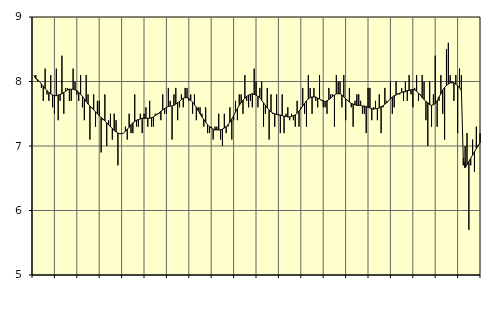
| Category | Transport, SNI 49-53 | Series 1 |
|---|---|---|
| nan | 8.1 | 8.1 |
| 1.0 | 8.1 | 8.04 |
| 1.0 | 8 | 8.03 |
| 1.0 | 8 | 8 |
| 1.0 | 7.9 | 7.96 |
| 1.0 | 7.7 | 7.93 |
| 1.0 | 8.2 | 7.89 |
| 1.0 | 7.8 | 7.86 |
| 1.0 | 7.7 | 7.83 |
| 1.0 | 8.1 | 7.81 |
| 1.0 | 7.6 | 7.79 |
| 1.0 | 7.5 | 7.78 |
| nan | 8.2 | 7.78 |
| 2.0 | 7.4 | 7.79 |
| 2.0 | 7.7 | 7.8 |
| 2.0 | 8.4 | 7.81 |
| 2.0 | 7.5 | 7.83 |
| 2.0 | 7.9 | 7.85 |
| 2.0 | 7.9 | 7.87 |
| 2.0 | 7.7 | 7.88 |
| 2.0 | 7.7 | 7.88 |
| 2.0 | 8.2 | 7.88 |
| 2.0 | 8 | 7.87 |
| 2.0 | 7.8 | 7.86 |
| nan | 7.7 | 7.83 |
| 3.0 | 8.1 | 7.8 |
| 3.0 | 7.6 | 7.77 |
| 3.0 | 7.4 | 7.73 |
| 3.0 | 8.1 | 7.69 |
| 3.0 | 7.8 | 7.65 |
| 3.0 | 7.1 | 7.62 |
| 3.0 | 7.6 | 7.59 |
| 3.0 | 7.8 | 7.56 |
| 3.0 | 7.3 | 7.53 |
| 3.0 | 7.7 | 7.5 |
| 3.0 | 7.7 | 7.47 |
| nan | 6.9 | 7.44 |
| 4.0 | 7.4 | 7.42 |
| 4.0 | 7.8 | 7.39 |
| 4.0 | 7 | 7.36 |
| 4.0 | 7.4 | 7.33 |
| 4.0 | 7.5 | 7.3 |
| 4.0 | 7.1 | 7.27 |
| 4.0 | 7.5 | 7.24 |
| 4.0 | 7.4 | 7.22 |
| 4.0 | 6.7 | 7.2 |
| 4.0 | 7.2 | 7.19 |
| 4.0 | 7.2 | 7.19 |
| nan | 7.2 | 7.2 |
| 5.0 | 7.3 | 7.23 |
| 5.0 | 7.1 | 7.26 |
| 5.0 | 7.5 | 7.29 |
| 5.0 | 7.2 | 7.33 |
| 5.0 | 7.2 | 7.36 |
| 5.0 | 7.8 | 7.38 |
| 5.0 | 7.3 | 7.4 |
| 5.0 | 7.3 | 7.41 |
| 5.0 | 7.5 | 7.42 |
| 5.0 | 7.2 | 7.43 |
| 5.0 | 7.5 | 7.43 |
| nan | 7.6 | 7.43 |
| 6.0 | 7.3 | 7.43 |
| 6.0 | 7.7 | 7.43 |
| 6.0 | 7.3 | 7.44 |
| 6.0 | 7.3 | 7.45 |
| 6.0 | 7.5 | 7.47 |
| 6.0 | 7.5 | 7.49 |
| 6.0 | 7.5 | 7.51 |
| 6.0 | 7.4 | 7.54 |
| 6.0 | 7.8 | 7.56 |
| 6.0 | 7.5 | 7.58 |
| 6.0 | 7.5 | 7.6 |
| nan | 7.9 | 7.61 |
| 7.0 | 7.7 | 7.62 |
| 7.0 | 7.1 | 7.62 |
| 7.0 | 7.8 | 7.63 |
| 7.0 | 7.9 | 7.65 |
| 7.0 | 7.4 | 7.67 |
| 7.0 | 7.6 | 7.69 |
| 7.0 | 7.8 | 7.72 |
| 7.0 | 7.6 | 7.74 |
| 7.0 | 7.9 | 7.75 |
| 7.0 | 7.9 | 7.75 |
| 7.0 | 7.7 | 7.74 |
| nan | 7.8 | 7.71 |
| 8.0 | 7.5 | 7.68 |
| 8.0 | 7.8 | 7.64 |
| 8.0 | 7.4 | 7.6 |
| 8.0 | 7.6 | 7.55 |
| 8.0 | 7.6 | 7.5 |
| 8.0 | 7.5 | 7.45 |
| 8.0 | 7.3 | 7.41 |
| 8.0 | 7.6 | 7.37 |
| 8.0 | 7.2 | 7.33 |
| 8.0 | 7.2 | 7.3 |
| 8.0 | 7.3 | 7.28 |
| nan | 7.1 | 7.26 |
| 9.0 | 7.3 | 7.25 |
| 9.0 | 7.3 | 7.25 |
| 9.0 | 7.5 | 7.25 |
| 9.0 | 7.1 | 7.25 |
| 9.0 | 7 | 7.26 |
| 9.0 | 7.5 | 7.28 |
| 9.0 | 7.2 | 7.3 |
| 9.0 | 7.3 | 7.33 |
| 9.0 | 7.6 | 7.37 |
| 9.0 | 7.1 | 7.42 |
| 9.0 | 7.4 | 7.47 |
| nan | 7.7 | 7.53 |
| 10.0 | 7.4 | 7.58 |
| 10.0 | 7.8 | 7.63 |
| 10.0 | 7.8 | 7.67 |
| 10.0 | 7.5 | 7.71 |
| 10.0 | 8.1 | 7.74 |
| 10.0 | 7.7 | 7.77 |
| 10.0 | 7.6 | 7.79 |
| 10.0 | 7.7 | 7.8 |
| 10.0 | 7.6 | 7.81 |
| 10.0 | 8.2 | 7.8 |
| 10.0 | 8 | 7.79 |
| nan | 7.6 | 7.77 |
| 11.0 | 7.9 | 7.75 |
| 11.0 | 8 | 7.71 |
| 11.0 | 7.3 | 7.67 |
| 11.0 | 7.5 | 7.63 |
| 11.0 | 7.9 | 7.59 |
| 11.0 | 7.1 | 7.56 |
| 11.0 | 7.8 | 7.53 |
| 11.0 | 7.5 | 7.51 |
| 11.0 | 7.3 | 7.5 |
| 11.0 | 7.8 | 7.49 |
| 11.0 | 7.5 | 7.48 |
| nan | 7.2 | 7.48 |
| 12.0 | 7.8 | 7.47 |
| 12.0 | 7.2 | 7.46 |
| 12.0 | 7.5 | 7.46 |
| 12.0 | 7.6 | 7.45 |
| 12.0 | 7.4 | 7.45 |
| 12.0 | 7.5 | 7.46 |
| 12.0 | 7.4 | 7.47 |
| 12.0 | 7.3 | 7.48 |
| 12.0 | 7.7 | 7.51 |
| 12.0 | 7.3 | 7.54 |
| 12.0 | 7.6 | 7.58 |
| nan | 7.9 | 7.62 |
| 13.0 | 7.5 | 7.66 |
| 13.0 | 7.3 | 7.7 |
| 13.0 | 8.1 | 7.73 |
| 13.0 | 7.9 | 7.75 |
| 13.0 | 7.5 | 7.76 |
| 13.0 | 7.9 | 7.76 |
| 13.0 | 7.7 | 7.76 |
| 13.0 | 7.6 | 7.74 |
| 13.0 | 8.1 | 7.73 |
| 13.0 | 7.7 | 7.71 |
| 13.0 | 7.6 | 7.7 |
| nan | 7.6 | 7.69 |
| 14.0 | 7.5 | 7.7 |
| 14.0 | 7.9 | 7.72 |
| 14.0 | 7.8 | 7.74 |
| 14.0 | 7.8 | 7.77 |
| 14.0 | 7.3 | 7.79 |
| 14.0 | 8.1 | 7.81 |
| 14.0 | 8 | 7.81 |
| 14.0 | 8 | 7.81 |
| 14.0 | 7.6 | 7.79 |
| 14.0 | 8.1 | 7.76 |
| 14.0 | 7.4 | 7.73 |
| nan | 7.7 | 7.71 |
| 15.0 | 7.9 | 7.68 |
| 15.0 | 7.6 | 7.66 |
| 15.0 | 7.3 | 7.65 |
| 15.0 | 7.7 | 7.64 |
| 15.0 | 7.8 | 7.63 |
| 15.0 | 7.8 | 7.63 |
| 15.0 | 7.7 | 7.63 |
| 15.0 | 7.5 | 7.62 |
| 15.0 | 7.5 | 7.62 |
| 15.0 | 7.2 | 7.61 |
| 15.0 | 7.9 | 7.6 |
| nan | 7.9 | 7.59 |
| 16.0 | 7.4 | 7.58 |
| 16.0 | 7.6 | 7.57 |
| 16.0 | 7.7 | 7.58 |
| 16.0 | 7.4 | 7.58 |
| 16.0 | 7.8 | 7.59 |
| 16.0 | 7.2 | 7.61 |
| 16.0 | 7.6 | 7.62 |
| 16.0 | 7.9 | 7.65 |
| 16.0 | 7.7 | 7.67 |
| 16.0 | 7.7 | 7.7 |
| 16.0 | 8 | 7.73 |
| nan | 7.5 | 7.76 |
| 17.0 | 7.6 | 7.78 |
| 17.0 | 8 | 7.79 |
| 17.0 | 7.8 | 7.81 |
| 17.0 | 7.8 | 7.82 |
| 17.0 | 7.9 | 7.83 |
| 17.0 | 7.7 | 7.84 |
| 17.0 | 8 | 7.84 |
| 17.0 | 7.7 | 7.86 |
| 17.0 | 8.1 | 7.86 |
| 17.0 | 7.8 | 7.87 |
| 17.0 | 7.6 | 7.88 |
| nan | 7.9 | 7.87 |
| 18.0 | 8.1 | 7.85 |
| 18.0 | 7.7 | 7.82 |
| 18.0 | 7.8 | 7.79 |
| 18.0 | 8.1 | 7.75 |
| 18.0 | 8 | 7.72 |
| 18.0 | 7.4 | 7.69 |
| 18.0 | 7 | 7.67 |
| 18.0 | 8 | 7.64 |
| 18.0 | 7.3 | 7.63 |
| 18.0 | 7.8 | 7.64 |
| 18.0 | 8.4 | 7.66 |
| nan | 7.3 | 7.7 |
| 19.0 | 7.7 | 7.76 |
| 19.0 | 8.1 | 7.81 |
| 19.0 | 7.5 | 7.87 |
| 19.0 | 7.1 | 7.91 |
| 19.0 | 8.5 | 7.94 |
| 19.0 | 8.6 | 7.96 |
| 19.0 | 8.1 | 7.98 |
| 19.0 | 8 | 7.98 |
| 19.0 | 7.7 | 7.98 |
| 19.0 | 8.1 | 7.96 |
| 19.0 | 7.2 | 7.93 |
| nan | 8.2 | 7.9 |
| 20.0 | 8.1 | 7.86 |
| 20.0 | 6.7 | 6.81 |
| 20.0 | 7 | 6.66 |
| 20.0 | 7.2 | 6.71 |
| 20.0 | 5.7 | 6.76 |
| 20.0 | 6.7 | 6.81 |
| 20.0 | 7.1 | 6.86 |
| 20.0 | 6.6 | 6.91 |
| 20.0 | 7.3 | 6.96 |
| 20.0 | 7 | 7.01 |
| 20.0 | 7.2 | 7.05 |